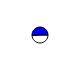
| Category | Series 0 |
|---|---|
| 0 | 2506256 |
| 1 | 2590406 |